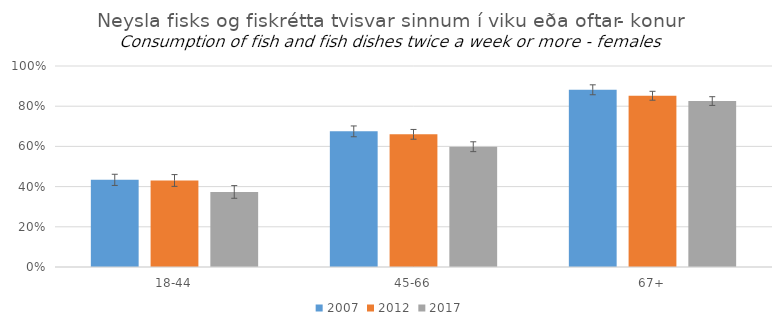
| Category | 2007 | 2012 | 2017 |
|---|---|---|---|
| 18-44 | 0.434 | 0.43 | 0.373 |
| 45-66 | 0.675 | 0.66 | 0.598 |
| 67+ | 0.882 | 0.852 | 0.826 |